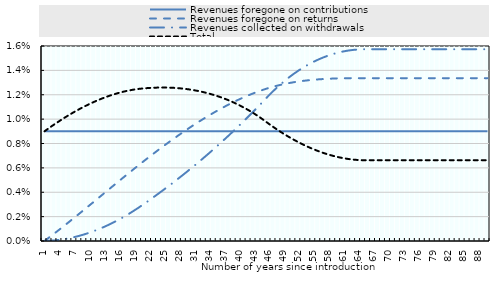
| Category | Revenues foregone on contributions | Revenues foregone on returns | Revenues collected on withdrawals | Total |
|---|---|---|---|---|
| 1.0 | 0.009 | 0 | 0 | 0.009 |
| 2.0 | 0.009 | 0 | 0 | 0.009 |
| 3.0 | 0.009 | 0.001 | 0 | 0.01 |
| 4.0 | 0.009 | 0.001 | 0 | 0.01 |
| 5.0 | 0.009 | 0.001 | 0 | 0.01 |
| 6.0 | 0.009 | 0.002 | 0 | 0.01 |
| 7.0 | 0.009 | 0.002 | 0 | 0.011 |
| 8.0 | 0.009 | 0.002 | 0 | 0.011 |
| 9.0 | 0.009 | 0.003 | 0.001 | 0.011 |
| 10.0 | 0.009 | 0.003 | 0.001 | 0.011 |
| 11.0 | 0.009 | 0.003 | 0.001 | 0.011 |
| 12.0 | 0.009 | 0.004 | 0.001 | 0.012 |
| 13.0 | 0.009 | 0.004 | 0.001 | 0.012 |
| 14.0 | 0.009 | 0.004 | 0.001 | 0.012 |
| 15.0 | 0.009 | 0.005 | 0.002 | 0.012 |
| 16.0 | 0.009 | 0.005 | 0.002 | 0.012 |
| 17.0 | 0.009 | 0.005 | 0.002 | 0.012 |
| 18.0 | 0.009 | 0.006 | 0.002 | 0.012 |
| 19.0 | 0.009 | 0.006 | 0.002 | 0.012 |
| 20.0 | 0.009 | 0.006 | 0.003 | 0.012 |
| 21.0 | 0.009 | 0.007 | 0.003 | 0.013 |
| 22.0 | 0.009 | 0.007 | 0.003 | 0.013 |
| 23.0 | 0.009 | 0.007 | 0.004 | 0.013 |
| 24.0 | 0.009 | 0.008 | 0.004 | 0.013 |
| 25.0 | 0.009 | 0.008 | 0.004 | 0.013 |
| 26.0 | 0.009 | 0.008 | 0.005 | 0.013 |
| 27.0 | 0.009 | 0.008 | 0.005 | 0.013 |
| 28.0 | 0.009 | 0.009 | 0.005 | 0.013 |
| 29.0 | 0.009 | 0.009 | 0.005 | 0.012 |
| 30.0 | 0.009 | 0.009 | 0.006 | 0.012 |
| 31.0 | 0.009 | 0.01 | 0.006 | 0.012 |
| 32.0 | 0.009 | 0.01 | 0.006 | 0.012 |
| 33.0 | 0.009 | 0.01 | 0.007 | 0.012 |
| 34.0 | 0.009 | 0.01 | 0.007 | 0.012 |
| 35.0 | 0.009 | 0.011 | 0.008 | 0.012 |
| 36.0 | 0.009 | 0.011 | 0.008 | 0.012 |
| 37.0 | 0.009 | 0.011 | 0.008 | 0.012 |
| 38.0 | 0.009 | 0.011 | 0.009 | 0.012 |
| 39.0 | 0.009 | 0.011 | 0.009 | 0.011 |
| 40.0 | 0.009 | 0.012 | 0.009 | 0.011 |
| 41.0 | 0.009 | 0.012 | 0.01 | 0.011 |
| 42.0 | 0.009 | 0.012 | 0.01 | 0.011 |
| 43.0 | 0.009 | 0.012 | 0.011 | 0.01 |
| 44.0 | 0.009 | 0.012 | 0.011 | 0.01 |
| 45.0 | 0.009 | 0.012 | 0.011 | 0.01 |
| 46.0 | 0.009 | 0.013 | 0.012 | 0.01 |
| 47.0 | 0.009 | 0.013 | 0.012 | 0.009 |
| 48.0 | 0.009 | 0.013 | 0.013 | 0.009 |
| 49.0 | 0.009 | 0.013 | 0.013 | 0.009 |
| 50.0 | 0.009 | 0.013 | 0.013 | 0.009 |
| 51.0 | 0.009 | 0.013 | 0.014 | 0.008 |
| 52.0 | 0.009 | 0.013 | 0.014 | 0.008 |
| 53.0 | 0.009 | 0.013 | 0.014 | 0.008 |
| 54.0 | 0.009 | 0.013 | 0.014 | 0.008 |
| 55.0 | 0.009 | 0.013 | 0.015 | 0.008 |
| 56.0 | 0.009 | 0.013 | 0.015 | 0.007 |
| 57.0 | 0.009 | 0.013 | 0.015 | 0.007 |
| 58.0 | 0.009 | 0.013 | 0.015 | 0.007 |
| 59.0 | 0.009 | 0.013 | 0.015 | 0.007 |
| 60.0 | 0.009 | 0.013 | 0.015 | 0.007 |
| 61.0 | 0.009 | 0.013 | 0.016 | 0.007 |
| 62.0 | 0.009 | 0.013 | 0.016 | 0.007 |
| 63.0 | 0.009 | 0.013 | 0.016 | 0.007 |
| 64.0 | 0.009 | 0.013 | 0.016 | 0.007 |
| 65.0 | 0.009 | 0.013 | 0.016 | 0.007 |
| 66.0 | 0.009 | 0.013 | 0.016 | 0.007 |
| 67.0 | 0.009 | 0.013 | 0.016 | 0.007 |
| 68.0 | 0.009 | 0.013 | 0.016 | 0.007 |
| 69.0 | 0.009 | 0.013 | 0.016 | 0.007 |
| 70.0 | 0.009 | 0.013 | 0.016 | 0.007 |
| 71.0 | 0.009 | 0.013 | 0.016 | 0.007 |
| 72.0 | 0.009 | 0.013 | 0.016 | 0.007 |
| 73.0 | 0.009 | 0.013 | 0.016 | 0.007 |
| 74.0 | 0.009 | 0.013 | 0.016 | 0.007 |
| 75.0 | 0.009 | 0.013 | 0.016 | 0.007 |
| 76.0 | 0.009 | 0.013 | 0.016 | 0.007 |
| 77.0 | 0.009 | 0.013 | 0.016 | 0.007 |
| 78.0 | 0.009 | 0.013 | 0.016 | 0.007 |
| 79.0 | 0.009 | 0.013 | 0.016 | 0.007 |
| 80.0 | 0.009 | 0.013 | 0.016 | 0.007 |
| 81.0 | 0.009 | 0.013 | 0.016 | 0.007 |
| 82.0 | 0.009 | 0.013 | 0.016 | 0.007 |
| 83.0 | 0.009 | 0.013 | 0.016 | 0.007 |
| 84.0 | 0.009 | 0.013 | 0.016 | 0.007 |
| 85.0 | 0.009 | 0.013 | 0.016 | 0.007 |
| 86.0 | 0.009 | 0.013 | 0.016 | 0.007 |
| 87.0 | 0.009 | 0.013 | 0.016 | 0.007 |
| 88.0 | 0.009 | 0.013 | 0.016 | 0.007 |
| 89.0 | 0.009 | 0.013 | 0.016 | 0.007 |
| 90.0 | 0.009 | 0.013 | 0.016 | 0.007 |